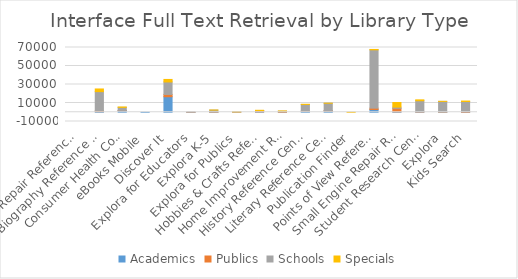
| Category | Academics | Publics | Schools | Specials |
|---|---|---|---|---|
| Auto Repair Reference Center | 0 | 0 | 0 | 0 |
| Biography Reference Center | 679 | 763 | 20851 | 2874 |
| Consumer Health Complete | 1690 | 294 | 3276 | 438 |
| eBooks Mobile | 1 | 0 | 0 | 0 |
| Discover It | 16778 | 2474 | 13496 | 2724 |
| Explora for Educators | 9 | 8 | 50 | 0 |
| Explora K-5 | 9 | 110 | 2243 | 26 |
| Explora for Publics | 0 | 83 | 368 | 42 |
| Hobbies & Crafts Reference Center | 487 | 1053 | 346 | 237 |
| Home Improvement Reference Center | 104 | 557 | 471 | 264 |
| History Reference Center | 918 | 206 | 7319 | 124 |
| Literary Reference Center / LRC Plus | 1339 | 472 | 7960 | 35 |
| Publication Finder | 0 | 0 | 0 | 2 |
| Points of View Reference Center | 2994 | 1432 | 63037 | 434 |
| Small Engine Repair Reference Center | 513 | 3746 | 1266 | 5033 |
| Student Research Center | 332 | 392 | 11713 | 971 |
| Explora | 20 | 57 | 11662 | 52 |
| Kids Search | 149 | 599 | 10882 | 487 |